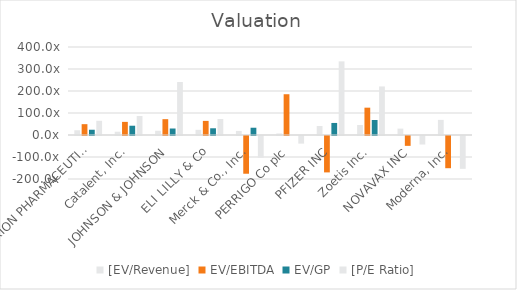
| Category | [EV/Revenue] | EV/EBITDA | EV/GP | [P/E Ratio] |
|---|---|---|---|---|
| ALEXION PHARMACEUTICALS, INC. | 21.579 | 49.267 | 23.86 | 64.562 |
| Catalent, Inc. | 14.888 | 59.627 | 42.163 | 86.318 |
| JOHNSON & JOHNSON | 19.251 | 71.932 | 29.512 | 240.769 |
| ELI LILLY & Co | 23.489 | 64.11 | 30.551 | 72.776 |
| Merck & Co., Inc. | 18.435 | -171.531 | 33.043 | -98.554 |
| PERRIGO Co plc | 6.884 | 185.316 | 0 | -34.667 |
| PFIZER INC | 40.922 | -165.442 | 54.775 | 334.636 |
| Zoetis Inc. | 45.509 | 124.222 | 68.188 | 220.667 |
| NOVAVAX INC | 29.001 | -44.795 | 0 | -38.719 |
| Moderna, Inc. | 68.577 | -146.41 | 0 | -149.243 |